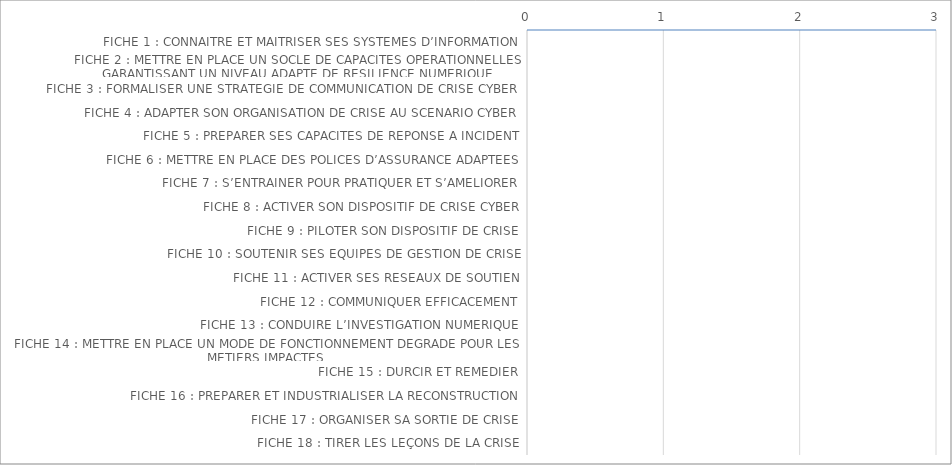
| Category | Moyenne |
|---|---|
| FICHE 1 : CONNAITRE ET MAITRISER SES SYSTEMES D’INFORMATION | 0 |
| FICHE 2 : METTRE EN PLACE UN SOCLE DE CAPACITES OPERATIONNELLES GARANTISSANT UN NIVEAU ADAPTE DE RESILIENCE NUMERIQUE | 0 |
| FICHE 3 : FORMALISER UNE STRATEGIE DE COMMUNICATION DE CRISE CYBER | 0 |
| FICHE 4 : ADAPTER SON ORGANISATION DE CRISE AU SCENARIO CYBER | 0 |
| FICHE 5 : PREPARER SES CAPACITES DE REPONSE A INCIDENT | 0 |
| FICHE 6 : METTRE EN PLACE DES POLICES D’ASSURANCE ADAPTEES | 0 |
| FICHE 7 : S’ENTRAINER POUR PRATIQUER ET S’AMELIORER | 0 |
| FICHE 8 : ACTIVER SON DISPOSITIF DE CRISE CYBER | 0 |
| FICHE 9 : PILOTER SON DISPOSITIF DE CRISE | 0 |
| FICHE 10 : SOUTENIR SES EQUIPES DE GESTION DE CRISE | 0 |
| FICHE 11 : ACTIVER SES RESEAUX DE SOUTIEN | 0 |
| FICHE 12 : COMMUNIQUER EFFICACEMENT | 0 |
| FICHE 13 : CONDUIRE L’INVESTIGATION NUMERIQUE | 0 |
| FICHE 14 : METTRE EN PLACE UN MODE DE FONCTIONNEMENT DEGRADE POUR LES METIERS IMPACTES | 0 |
| FICHE 15 : DURCIR ET REMEDIER | 0 |
| FICHE 16 : PREPARER ET INDUSTRIALISER LA RECONSTRUCTION | 0 |
| FICHE 17 : ORGANISER SA SORTIE DE CRISE | 0 |
| FICHE 18 : TIRER LES LEÇONS DE LA CRISE | 0 |